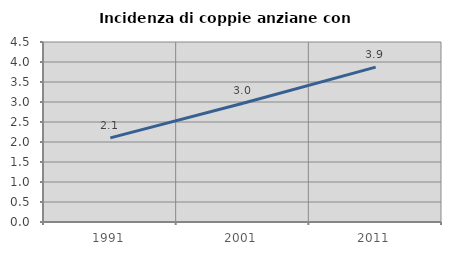
| Category | Incidenza di coppie anziane con figli |
|---|---|
| 1991.0 | 2.104 |
| 2001.0 | 2.969 |
| 2011.0 | 3.873 |